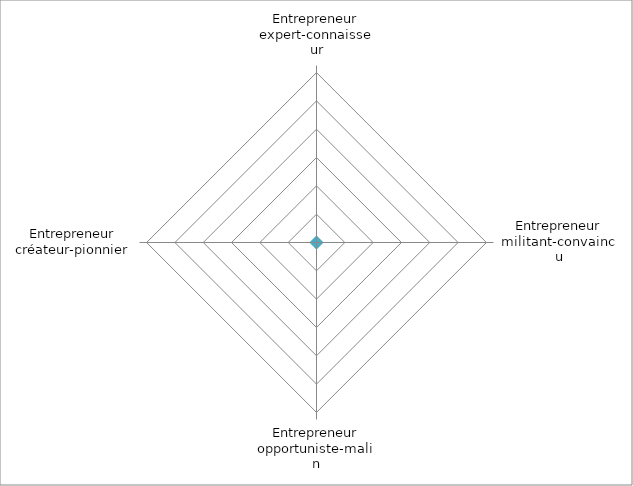
| Category | Series 0 |
|---|---|
| Entrepreneur
expert-connaisseur | 0 |
| Entrepreneur
militant-convaincu | 0 |
| Entrepreneur
opportuniste-malin | 0 |
| Entrepreneur
créateur-pionnier | 0 |